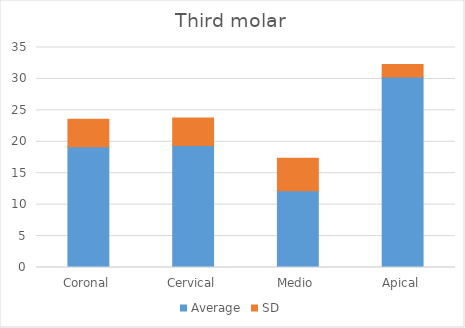
| Category | Average | SD |
|---|---|---|
| Coronal | 19.2 | 4.4 |
| Cervical | 19.4 | 4.4 |
| Medio | 12.2 | 5.2 |
| Apical | 30.3 | 2 |